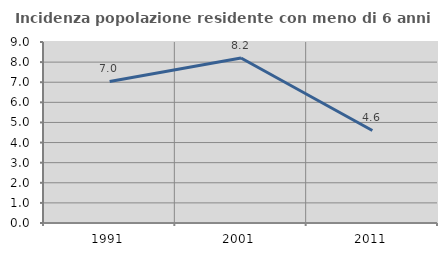
| Category | Incidenza popolazione residente con meno di 6 anni |
|---|---|
| 1991.0 | 7.04 |
| 2001.0 | 8.202 |
| 2011.0 | 4.601 |